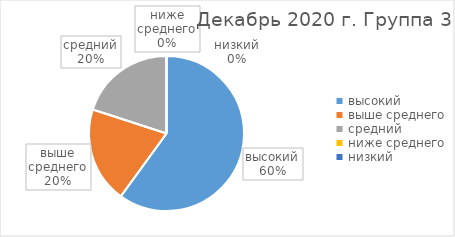
| Category | Series 0 |
|---|---|
| высокий | 6 |
| выше среднего | 2 |
| средний | 2 |
| ниже среднего | 0 |
| низкий | 0 |